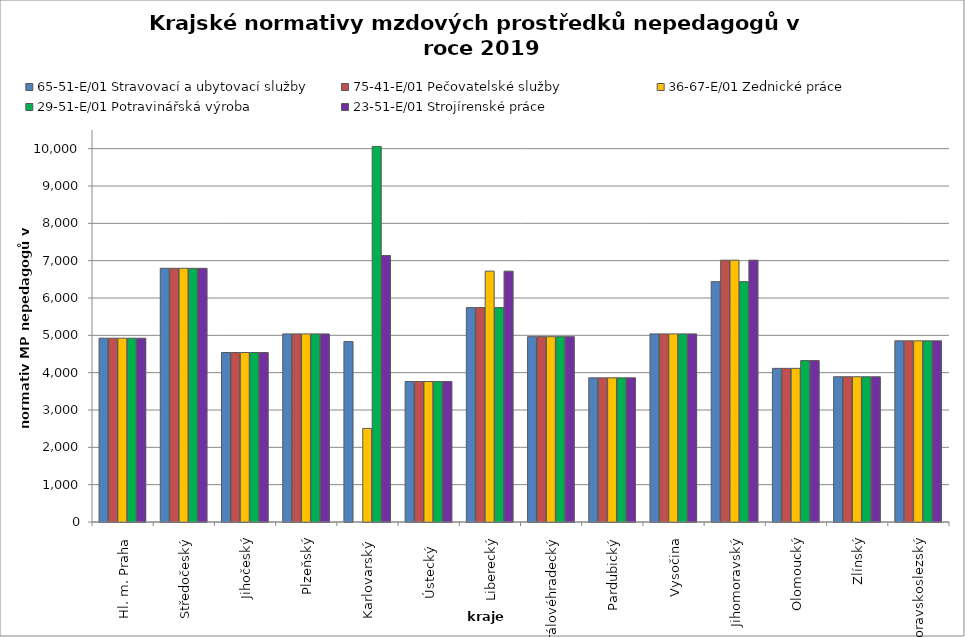
| Category | 65-51-E/01 Stravovací a ubytovací služby | 75-41-E/01 Pečovatelské služby | 36-67-E/01 Zednické práce | 29-51-E/01 Potravinářská výroba | 23-51-E/01 Strojírenské práce |
|---|---|---|---|---|---|
| Hl. m. Praha | 4923.232 | 4923.232 | 4923.232 | 4923.232 | 4923.232 |
| Středočeský | 6795.429 | 6795.429 | 6795.429 | 6795.429 | 6795.429 |
| Jihočeský | 4539.802 | 4539.802 | 4539.802 | 4539.802 | 4539.802 |
| Plzeňský | 5038.623 | 5038.623 | 5038.623 | 5038.623 | 5038.623 |
| Karlovarský  | 4832.536 | 0 | 2506.722 | 10059.761 | 7137.809 |
| Ústecký   | 3762.83 | 3762.83 | 3762.83 | 3762.83 | 3762.83 |
| Liberecký | 5743.214 | 5743.214 | 6719.126 | 5743.214 | 6719.126 |
| Královéhradecký | 4964.339 | 4964.339 | 4964.339 | 4964.339 | 4964.339 |
| Pardubický | 3861.37 | 3861.37 | 3861.37 | 3861.37 | 3861.37 |
| Vysočina | 5038.834 | 5038.834 | 5038.834 | 5038.834 | 5038.834 |
| Jihomoravský | 6437.976 | 7013.085 | 7013.085 | 6437.976 | 7013.085 |
| Olomoucký | 4115.744 | 4115.744 | 4115.744 | 4324.654 | 4324.654 |
| Zlínský | 3891.028 | 3891.028 | 3891.028 | 3891.028 | 3891.028 |
| Moravskoslezský | 4853.235 | 4853.235 | 4853.235 | 4853.235 | 4853.235 |